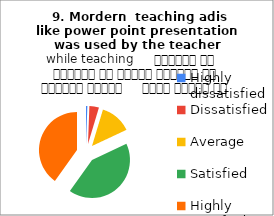
| Category |  9. Mordern  teaching adis like power point presentation was used by the teacher while teaching     शिक्षक ने शिक्षण के दौरान शिक्षण की आधुनिक तकनीक     पावर पॉइंट का प्रयोग किया |
|---|---|
| Highly dissatisfied | 1 |
| Dissatisfied | 7 |
| Average | 23 |
| Satisfied | 72 |
| Highly satisfied | 69 |